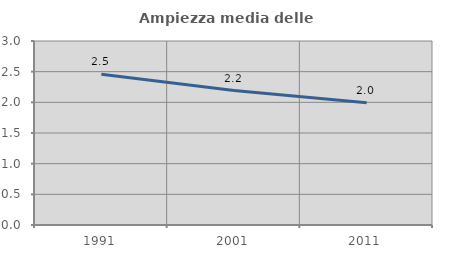
| Category | Ampiezza media delle famiglie |
|---|---|
| 1991.0 | 2.457 |
| 2001.0 | 2.192 |
| 2011.0 | 1.992 |